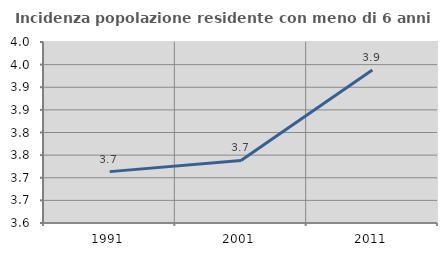
| Category | Incidenza popolazione residente con meno di 6 anni |
|---|---|
| 1991.0 | 3.714 |
| 2001.0 | 3.738 |
| 2011.0 | 3.938 |